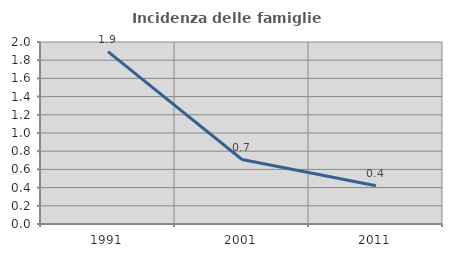
| Category | Incidenza delle famiglie numerose |
|---|---|
| 1991.0 | 1.893 |
| 2001.0 | 0.709 |
| 2011.0 | 0.421 |